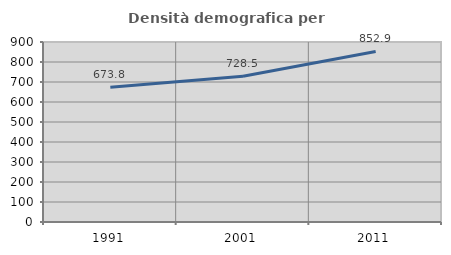
| Category | Densità demografica |
|---|---|
| 1991.0 | 673.846 |
| 2001.0 | 728.458 |
| 2011.0 | 852.877 |